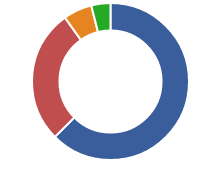
| Category | Series 0 |
|---|---|
| PI Payment | 793.305 |
| Property Tax | 350 |
| Insurance | 75 |
| PMI | 0 |
| HOA | 50 |
| Other | 0 |